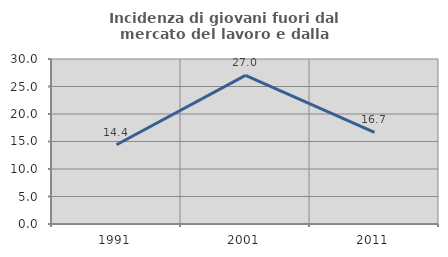
| Category | Incidenza di giovani fuori dal mercato del lavoro e dalla formazione  |
|---|---|
| 1991.0 | 14.414 |
| 2001.0 | 27.021 |
| 2011.0 | 16.667 |